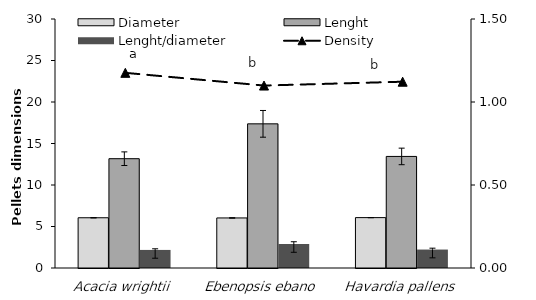
| Category | Diameter | Lenght | Lenght/diameter |
|---|---|---|---|
| Acacia wrightii | 6.053 | 13.169 | 2.178 |
| Ebenopsis ebano | 6.03 | 17.368 | 2.893 |
| Havardia pallens | 6.07 | 13.443 | 2.222 |